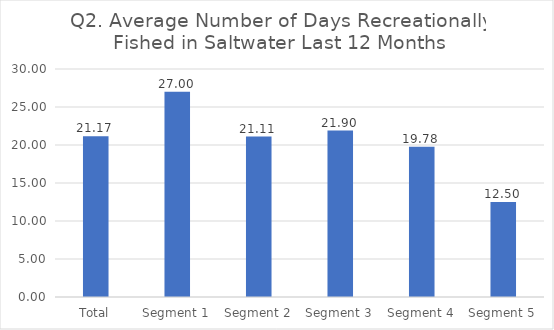
| Category | Series 0 |
|---|---|
| Total | 21.167 |
| Segment 1 | 27 |
| Segment 2 | 21.111 |
| Segment 3 | 21.897 |
| Segment 4 | 19.783 |
| Segment 5 | 12.5 |